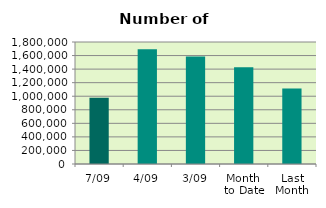
| Category | Series 0 |
|---|---|
| 7/09 | 977394 |
| 4/09 | 1691190 |
| 3/09 | 1587182 |
| Month 
to Date | 1427226.4 |
| Last
Month | 1113186.286 |